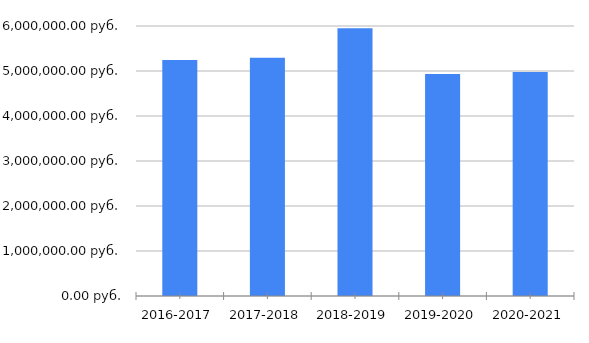
| Category | Расходы спонсора на школу |
|---|---|
| 2016-2017 | 5242560 |
| 2017-2018 | 5291700 |
| 2018-2019 | 5952000 |
| 2019-2020 | 4933280 |
| 2020-2021 | 4979763 |